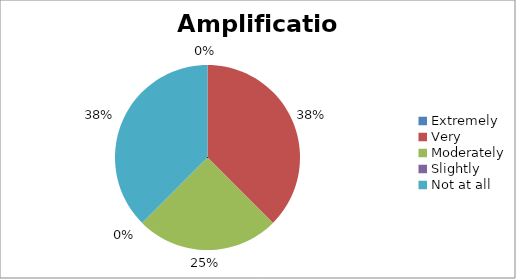
| Category | Amplification |
|---|---|
| Extremely | 0 |
| Very | 3 |
| Moderately | 2 |
| Slightly | 0 |
| Not at all | 3 |